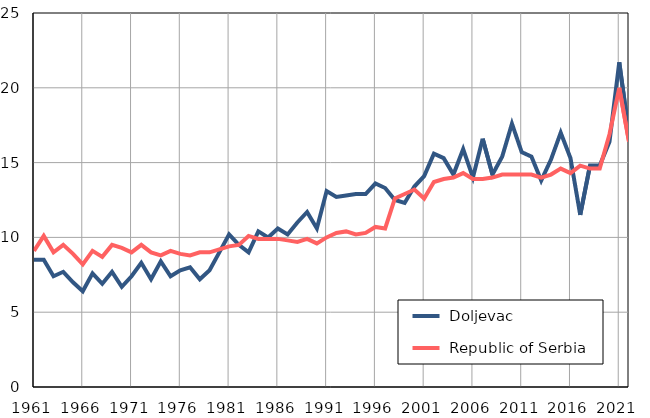
| Category |  Doljevac |  Republic of Serbia |
|---|---|---|
| 1961.0 | 8.5 | 9.1 |
| 1962.0 | 8.5 | 10.1 |
| 1963.0 | 7.4 | 9 |
| 1964.0 | 7.7 | 9.5 |
| 1965.0 | 7 | 8.9 |
| 1966.0 | 6.4 | 8.2 |
| 1967.0 | 7.6 | 9.1 |
| 1968.0 | 6.9 | 8.7 |
| 1969.0 | 7.7 | 9.5 |
| 1970.0 | 6.7 | 9.3 |
| 1971.0 | 7.4 | 9 |
| 1972.0 | 8.3 | 9.5 |
| 1973.0 | 7.2 | 9 |
| 1974.0 | 8.4 | 8.8 |
| 1975.0 | 7.4 | 9.1 |
| 1976.0 | 7.8 | 8.9 |
| 1977.0 | 8 | 8.8 |
| 1978.0 | 7.2 | 9 |
| 1979.0 | 7.8 | 9 |
| 1980.0 | 9 | 9.2 |
| 1981.0 | 10.2 | 9.4 |
| 1982.0 | 9.5 | 9.5 |
| 1983.0 | 9 | 10.1 |
| 1984.0 | 10.4 | 9.9 |
| 1985.0 | 10 | 9.9 |
| 1986.0 | 10.6 | 9.9 |
| 1987.0 | 10.2 | 9.8 |
| 1988.0 | 11 | 9.7 |
| 1989.0 | 11.7 | 9.9 |
| 1990.0 | 10.6 | 9.6 |
| 1991.0 | 13.1 | 10 |
| 1992.0 | 12.7 | 10.3 |
| 1993.0 | 12.8 | 10.4 |
| 1994.0 | 12.9 | 10.2 |
| 1995.0 | 12.9 | 10.3 |
| 1996.0 | 13.6 | 10.7 |
| 1997.0 | 13.3 | 10.6 |
| 1998.0 | 12.5 | 12.6 |
| 1999.0 | 12.3 | 12.9 |
| 2000.0 | 13.4 | 13.2 |
| 2001.0 | 14.1 | 12.6 |
| 2002.0 | 15.6 | 13.7 |
| 2003.0 | 15.3 | 13.9 |
| 2004.0 | 14.2 | 14 |
| 2005.0 | 15.9 | 14.3 |
| 2006.0 | 14 | 13.9 |
| 2007.0 | 16.6 | 13.9 |
| 2008.0 | 14.2 | 14 |
| 2009.0 | 15.4 | 14.2 |
| 2010.0 | 17.6 | 14.2 |
| 2011.0 | 15.7 | 14.2 |
| 2012.0 | 15.4 | 14.2 |
| 2013.0 | 13.8 | 14 |
| 2014.0 | 15.2 | 14.2 |
| 2015.0 | 17 | 14.6 |
| 2016.0 | 15.3 | 14.3 |
| 2017.0 | 11.5 | 14.8 |
| 2018.0 | 14.8 | 14.6 |
| 2019.0 | 14.8 | 14.6 |
| 2020.0 | 16.4 | 16.9 |
| 2021.0 | 21.7 | 20 |
| 2022.0 | 16.9 | 16.4 |